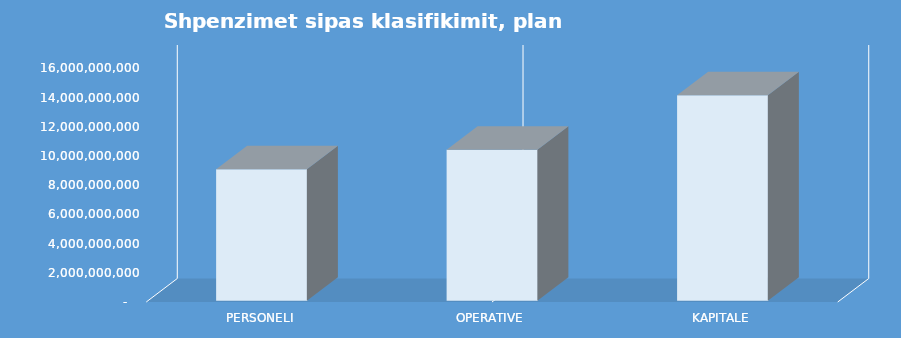
| Category | Vlera |
|---|---|
| Personeli | 9014258614 |
| Operative | 10350832461 |
| Kapitale | 14074448564 |